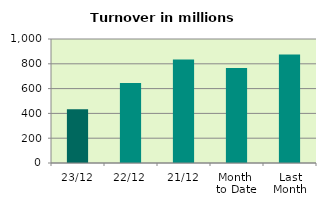
| Category | Series 0 |
|---|---|
| 23/12 | 434.115 |
| 22/12 | 644.85 |
| 21/12 | 833.967 |
| Month 
to Date | 766.591 |
| Last
Month | 874.327 |